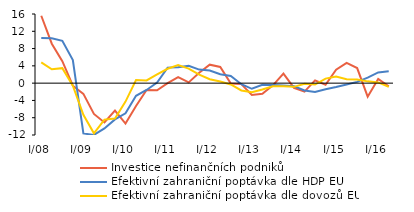
| Category | Investice nefinančních podniků | Efektivní zahraniční poptávka dle HDP EU | Efektivní zahraniční poptávka dle dovozů EU |
|---|---|---|---|
| I/08 | 15.593 | 10.436 | 4.821 |
| II | 9.127 | 10.375 | 3.221 |
| III | 5.095 | 9.778 | 3.471 |
| IV | -0.59 | 5.356 | -0.609 |
| I/09 | -2.487 | -11.644 | -7.319 |
| II | -7.118 | -11.985 | -11.619 |
| III | -9.088 | -10.47 | -8.432 |
| IV | -6.36 | -8.386 | -8.192 |
| I/10 | -9.364 | -6.981 | -4.273 |
| II | -5.306 | -2.934 | 0.707 |
| III | -1.6 | -1.582 | 0.617 |
| IV | -1.67 | 0.156 | 2.005 |
| I/11 | -0.008 | 3.593 | 3.322 |
| II | 1.393 | 3.693 | 4.187 |
| III | 0.171 | 4.004 | 3.377 |
| IV | 2.428 | 3.134 | 1.979 |
| I/12 | 4.275 | 2.934 | 0.905 |
| II | 3.743 | 2.049 | 0.387 |
| III | -0.083 | 1.674 | -0.3 |
| IV | -0.226 | -0.243 | -1.697 |
| I/13 | -2.735 | -1.307 | -2.101 |
| II | -2.459 | -0.38 | -1.459 |
| III | -0.502 | -0.451 | -0.705 |
| IV | 2.192 | -0.531 | -0.72 |
| I/14 | -1.078 | -0.692 | -0.861 |
| II | -1.955 | -1.703 | -0.125 |
| III | 0.628 | -2.056 | -0.331 |
| IV | -0.371 | -1.405 | 1.043 |
| I/15 | 3.098 | -0.906 | 1.515 |
| II | 4.674 | -0.333 | 0.882 |
| III | 3.483 | 0.289 | 0.862 |
| IV | -3.126 | 1.275 | 0.413 |
| I/16 | 0.982 | 2.487 | 0.174 |
| II | -0.752 | 2.758 | -0.866 |